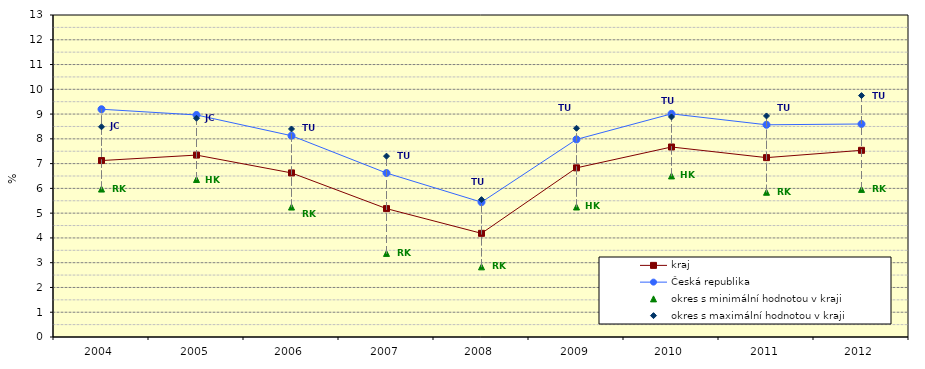
| Category | kraj | Česká republika | okres s minimální hodnotou v kraji | okres s maximální hodnotou v kraji |
|---|---|---|---|---|
| 2004.0 | 7.124 | 9.195 | 5.973 | 8.486 |
| 2005.0 | 7.344 | 8.965 | 6.359 | 8.832 |
| 2006.0 | 6.624 | 8.126 | 5.246 | 8.399 |
| 2007.0 | 5.183 | 6.619 | 3.375 | 7.302 |
| 2008.0 | 4.185 | 5.444 | 2.832 | 5.546 |
| 2009.0 | 6.829 | 7.977 | 5.249 | 8.427 |
| 2010.0 | 7.671 | 9.009 | 6.503 | 8.884 |
| 2011.0 | 7.241 | 8.568 | 5.844 | 8.925 |
| 2012.0 | 7.537 | 8.6 | 5.959 | 9.746 |